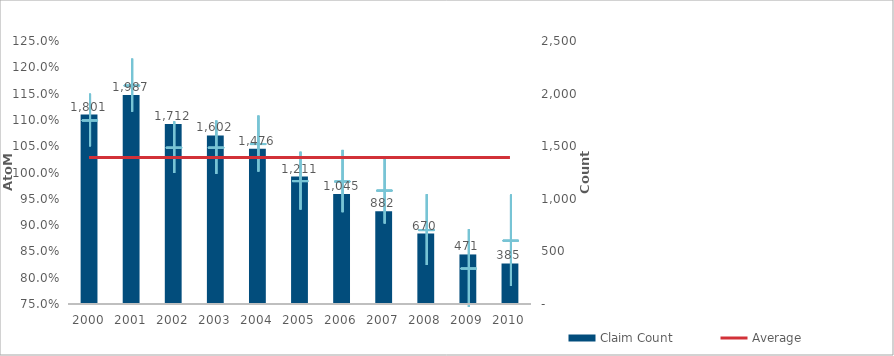
| Category | Claim Count |
|---|---|
| 0 | 1801 |
| 1 | 1987 |
| 2 | 1712 |
| 3 | 1602 |
| 4 | 1476 |
| 5 | 1211 |
| 6 | 1045 |
| 7 | 882 |
| 8 | 670 |
| 9 | 471 |
| 10 | 385 |